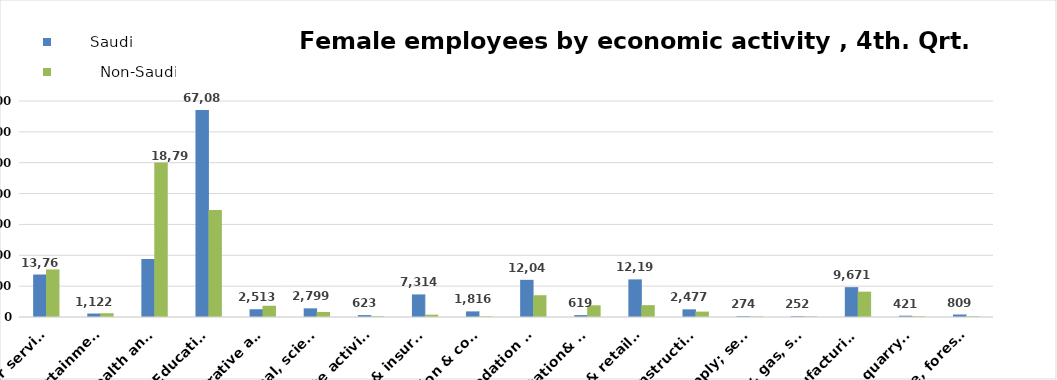
| Category |        Saudi      |          Non-Saudi        |
|---|---|---|
| Agriculture, forestry & fishing | 809 | 246 |
| Mining & quarrying | 421 | 256 |
| Manufacturing | 9671 | 8208 |
| Electricity, gas, steam & air conditioning supply | 252 | 199 |
| Water supply; sewerage, waste remediation  | 274 | 166 |
| Construction | 2477 | 1748 |
| Wholesale& retail trade; repair of motor vehicles | 12192 | 3846 |
| Transportation& storage | 619 | 3787 |
| Accommodation & food service activities | 12042 | 7054 |
| Information & communication | 1816 | 205 |
| Financial & insurance | 7314 | 751 |
| Real estate activities | 623 | 250 |
| Professional, scientific & technical activities | 2799 | 1624 |
| Administrative and support service activities | 2513 | 3648 |
| Education | 67080 | 34655 |
| Human health and &l work activities | 18792 | 50094 |
| Arts, entertainment & recreation | 1122 | 1214 |
| Other service | 13768 | 15407 |